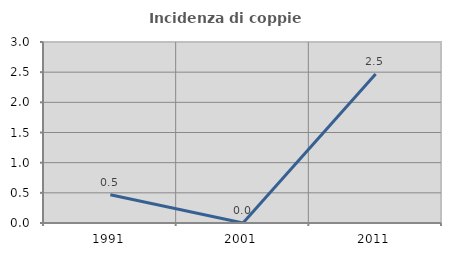
| Category | Incidenza di coppie miste |
|---|---|
| 1991.0 | 0.467 |
| 2001.0 | 0 |
| 2011.0 | 2.469 |